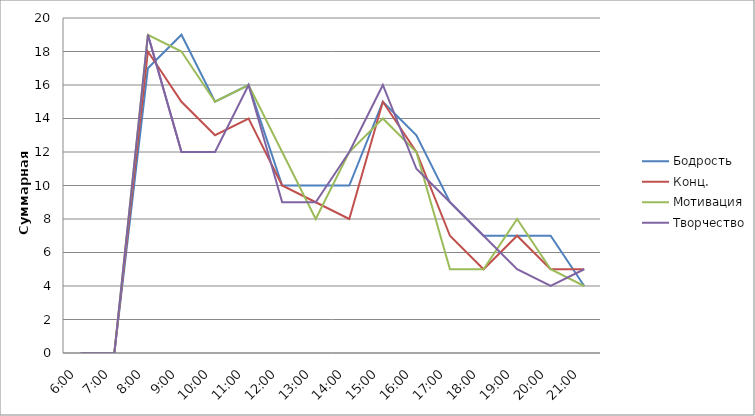
| Category | Бодрость | Конц. | Мотивация | Творчество |
|---|---|---|---|---|
| 0.25 | 0 | 0 | 0 | 0 |
| 0.2916666666666667 | 0 | 0 | 0 | 0 |
| 0.3333333333333333 | 17 | 18 | 19 | 19 |
| 0.375 | 19 | 15 | 18 | 12 |
| 0.4166666666666667 | 15 | 13 | 15 | 12 |
| 0.4583333333333333 | 16 | 14 | 16 | 16 |
| 0.5 | 10 | 10 | 12 | 9 |
| 0.5416666666666666 | 10 | 9 | 8 | 9 |
| 0.5833333333333334 | 10 | 8 | 12 | 12 |
| 0.625 | 15 | 15 | 14 | 16 |
| 0.6666666666666666 | 13 | 12 | 12 | 11 |
| 0.7083333333333334 | 9 | 7 | 5 | 9 |
| 0.75 | 7 | 5 | 5 | 7 |
| 0.7916666666666666 | 7 | 7 | 8 | 5 |
| 0.8333333333333334 | 7 | 5 | 5 | 4 |
| 0.875 | 4 | 5 | 4 | 5 |